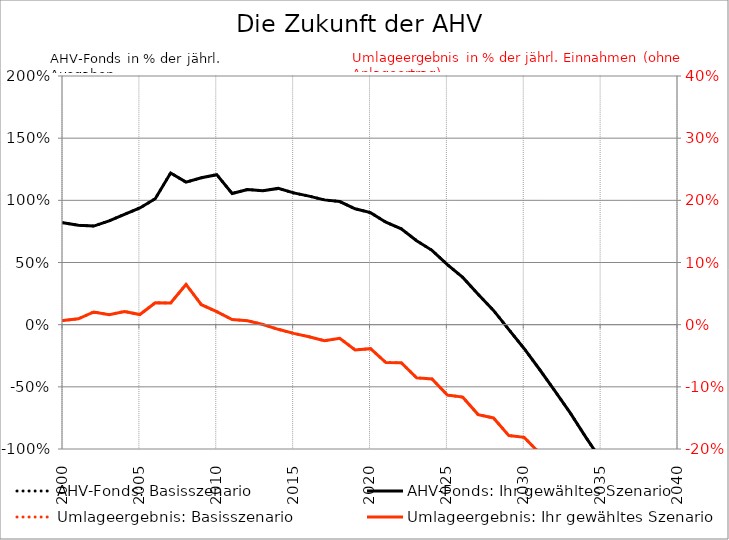
| Category | AHV-Fonds: Basisszenario | AHV-Fonds: Ihr gewähltes Szenario |
|---|---|---|
| 2000.0 | 0.82 | 0.82 |
| 2001.0 | 0.8 | 0.8 |
| 2002.0 | 0.793 | 0.793 |
| 2003.0 | 0.835 | 0.835 |
| 2004.0 | 0.888 | 0.888 |
| 2005.0 | 0.938 | 0.938 |
| 2006.0 | 1.013 | 1.013 |
| 2007.0 | 1.22 | 1.22 |
| 2008.0 | 1.146 | 1.146 |
| 2009.0 | 1.181 | 1.181 |
| 2010.0 | 1.206 | 1.206 |
| 2011.0 | 1.055 | 1.055 |
| 2012.0 | 1.087 | 1.087 |
| 2013.0 | 1.078 | 1.078 |
| 2014.0 | 1.096 | 1.096 |
| 2015.0 | 1.06 | 1.06 |
| 2016.0 | 1.034 | 1.034 |
| 2017.0 | 1.004 | 1.004 |
| 2018.0 | 0.99 | 0.99 |
| 2019.0 | 0.932 | 0.932 |
| 2020.0 | 0.901 | 0.901 |
| 2021.0 | 0.824 | 0.824 |
| 2022.0 | 0.771 | 0.771 |
| 2023.0 | 0.676 | 0.676 |
| 2024.0 | 0.598 | 0.598 |
| 2025.0 | 0.483 | 0.483 |
| 2026.0 | 0.38 | 0.38 |
| 2027.0 | 0.245 | 0.245 |
| 2028.0 | 0.115 | 0.115 |
| 2029.0 | -0.04 | -0.04 |
| 2030.0 | -0.193 | -0.193 |
| 2031.0 | -0.361 | -0.361 |
| 2032.0 | -0.535 | -0.535 |
| 2033.0 | -0.712 | -0.712 |
| 2034.0 | -0.904 | -0.904 |
| 2035.0 | -1.089 | -1.089 |
| 2036.0 | -1.298 | -1.298 |
| 2037.0 | -1.489 | -1.489 |
| 2038.0 | -1.713 | -1.713 |
| 2039.0 | -1.907 | -1.907 |
| 2040.0 | -2.146 | -2.146 |